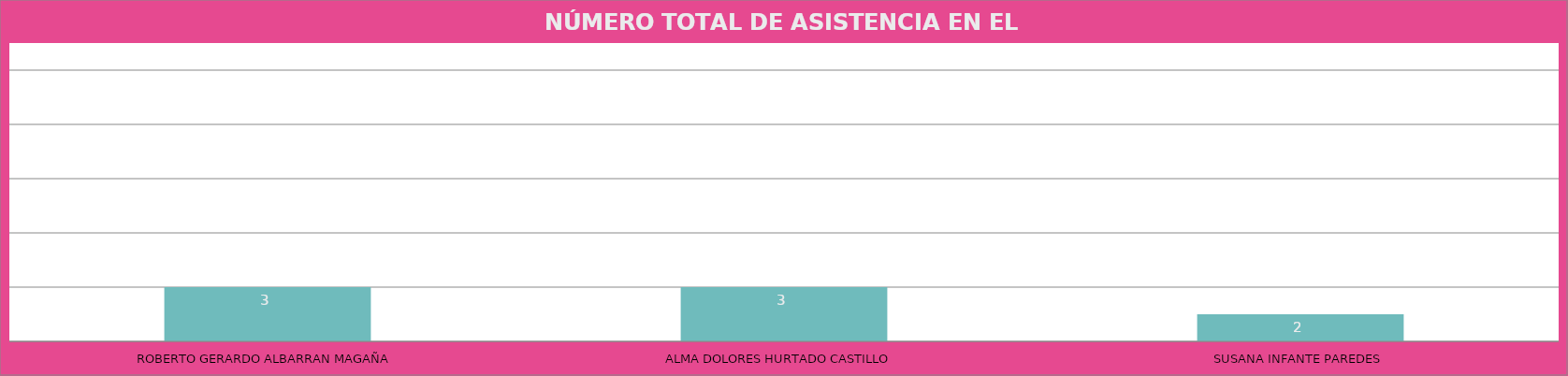
| Category | ROBERTO GERARDO ALBARRAN MAGAÑA |
|---|---|
| ROBERTO GERARDO ALBARRAN MAGAÑA | 3 |
| ALMA DOLORES HURTADO CASTILLO  | 3 |
| SUSANA INFANTE PAREDES | 2 |